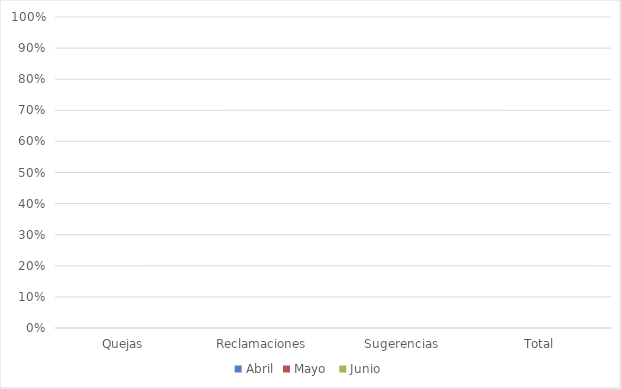
| Category | Abril | Mayo  | Junio |
|---|---|---|---|
| Quejas | 0 | 0 | 0 |
| Reclamaciones | 0 | 0 | 0 |
| Sugerencias | 0 | 0 | 0 |
| Total | 0 | 0 | 0 |